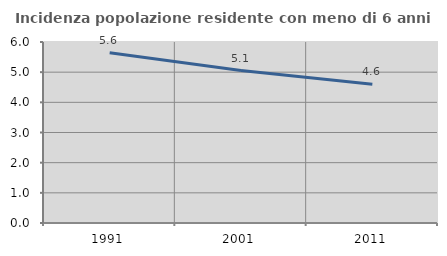
| Category | Incidenza popolazione residente con meno di 6 anni |
|---|---|
| 1991.0 | 5.644 |
| 2001.0 | 5.055 |
| 2011.0 | 4.601 |